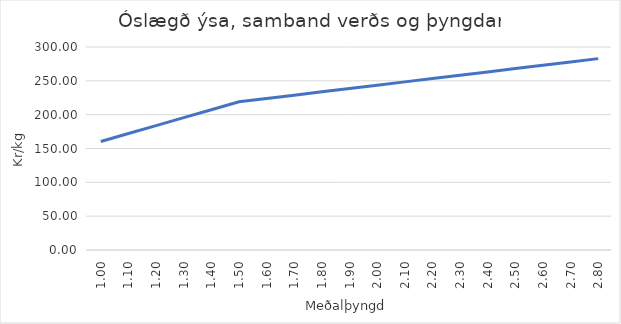
| Category | Series 0 |
|---|---|
| 1.0 | 160.442 |
| 1.1 | 172.159 |
| 1.2 | 183.875 |
| 1.3 | 195.591 |
| 1.4 | 207.308 |
| 1.5 | 219.024 |
| 1.6 | 223.932 |
| 1.7 | 228.839 |
| 1.8 | 233.747 |
| 1.9 | 238.654 |
| 2.0 | 243.562 |
| 2.1 | 248.47 |
| 2.2 | 253.377 |
| 2.3 | 258.285 |
| 2.4 | 263.193 |
| 2.5 | 268.1 |
| 2.6 | 273.008 |
| 2.7 | 277.916 |
| 2.8 | 282.823 |